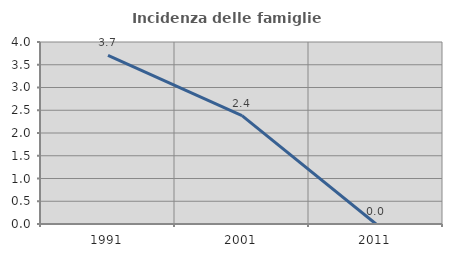
| Category | Incidenza delle famiglie numerose |
|---|---|
| 1991.0 | 3.704 |
| 2001.0 | 2.381 |
| 2011.0 | 0 |